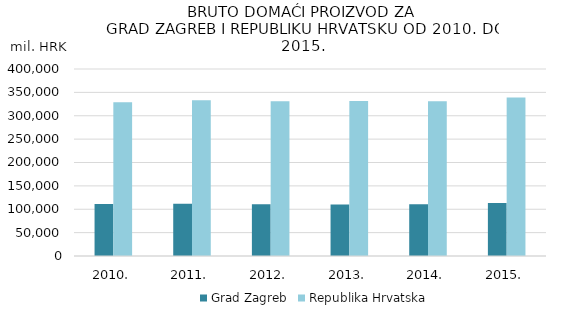
| Category | Grad Zagreb | Republika Hrvatska |
|---|---|---|
| 2010. | 111003 | 328942 |
| 2011. | 111743 | 333326 |
| 2012. | 110804 | 330925 |
| 2013. | 110200 | 331374 |
| 2014. | 110501 | 331266 |
| 2015. | 113199 | 338975 |